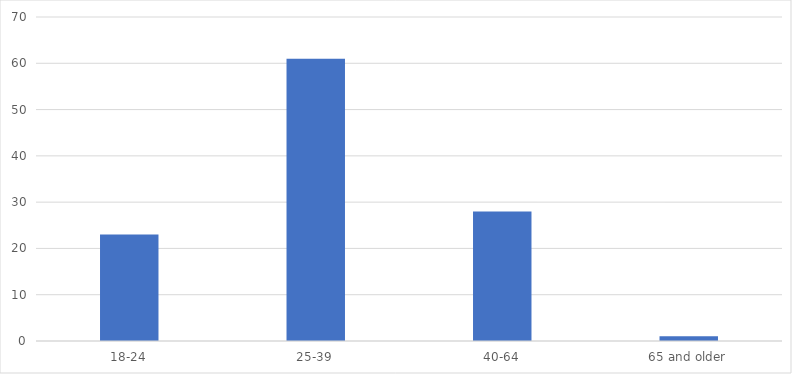
| Category | Number of Responses |
|---|---|
| 18-24 | 23 |
| 25-39 | 61 |
| 40-64 | 28 |
| 65 and older | 1 |